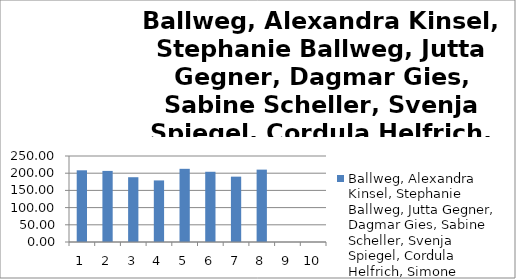
| Category | Ballweg, Alexandra Kinsel, Stephanie Ballweg, Jutta Gegner, Dagmar Gies, Sabine Scheller, Svenja Spiegel, Cordula Helfrich, Simone Daemen, Evelyn König, Yvonne |
|---|---|
| 0 | 208.42 |
| 1 | 206.65 |
| 2 | 188.31 |
| 3 | 179.01 |
| 4 | 212.74 |
| 5 | 204.16 |
| 6 | 189.96 |
| 7 | 210.39 |
| 8 | 0 |
| 9 | 0 |